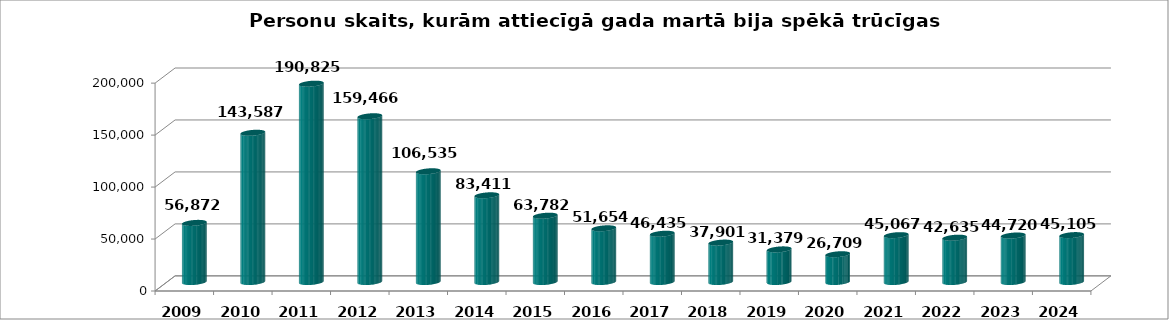
| Category | marts |
|---|---|
| 2009.0 | 56872 |
| 2010.0 | 143587 |
| 2011.0 | 190825 |
| 2012.0 | 159466 |
| 2013.0 | 106535 |
| 2014.0 | 83411 |
| 2015.0 | 63782 |
| 2016.0 | 51654 |
| 2017.0 | 46435 |
| 2018.0 | 37901 |
| 2019.0 | 31379 |
| 2020.0 | 26709 |
| 2021.0 | 45067 |
| 2022.0 | 42635 |
| 2023.0 | 44720 |
| 2024.0 | 45105 |